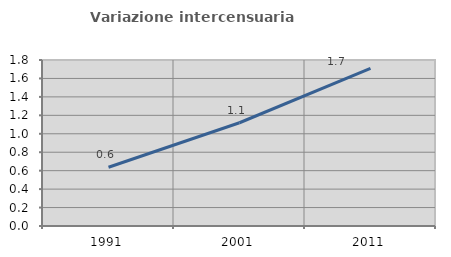
| Category | Variazione intercensuaria annua |
|---|---|
| 1991.0 | 0.637 |
| 2001.0 | 1.12 |
| 2011.0 | 1.71 |